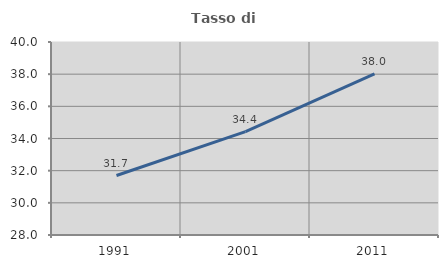
| Category | Tasso di occupazione   |
|---|---|
| 1991.0 | 31.699 |
| 2001.0 | 34.432 |
| 2011.0 | 38.022 |